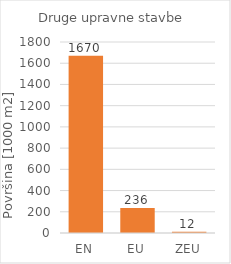
| Category | Series 0 |
|---|---|
| EN | 1670330.8 |
| EU | 235563.7 |
| ZEU | 11655.3 |